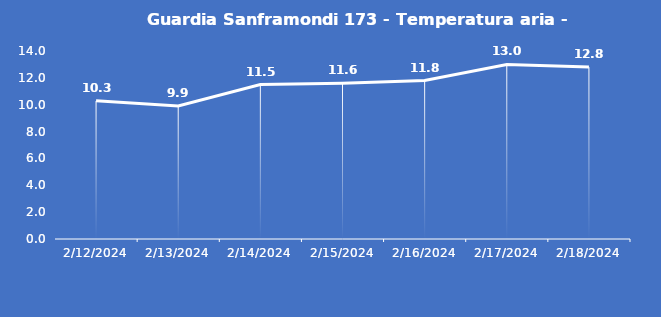
| Category | Guardia Sanframondi 173 - Temperatura aria - Grezzo (°C) |
|---|---|
| 2/12/24 | 10.3 |
| 2/13/24 | 9.9 |
| 2/14/24 | 11.5 |
| 2/15/24 | 11.6 |
| 2/16/24 | 11.8 |
| 2/17/24 | 13 |
| 2/18/24 | 12.8 |